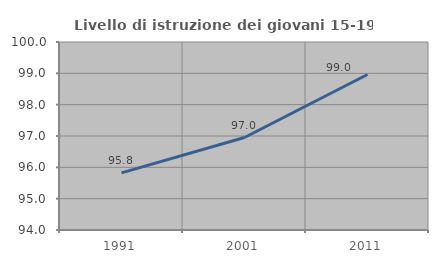
| Category | Livello di istruzione dei giovani 15-19 anni |
|---|---|
| 1991.0 | 95.823 |
| 2001.0 | 96.951 |
| 2011.0 | 98.964 |